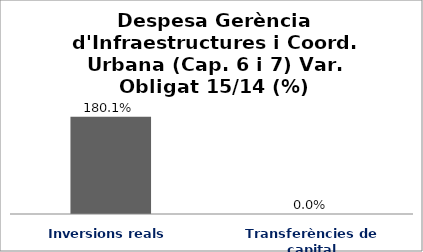
| Category | Series 0 |
|---|---|
| Inversions reals | 1.801 |
| Transferències de capital | 0 |